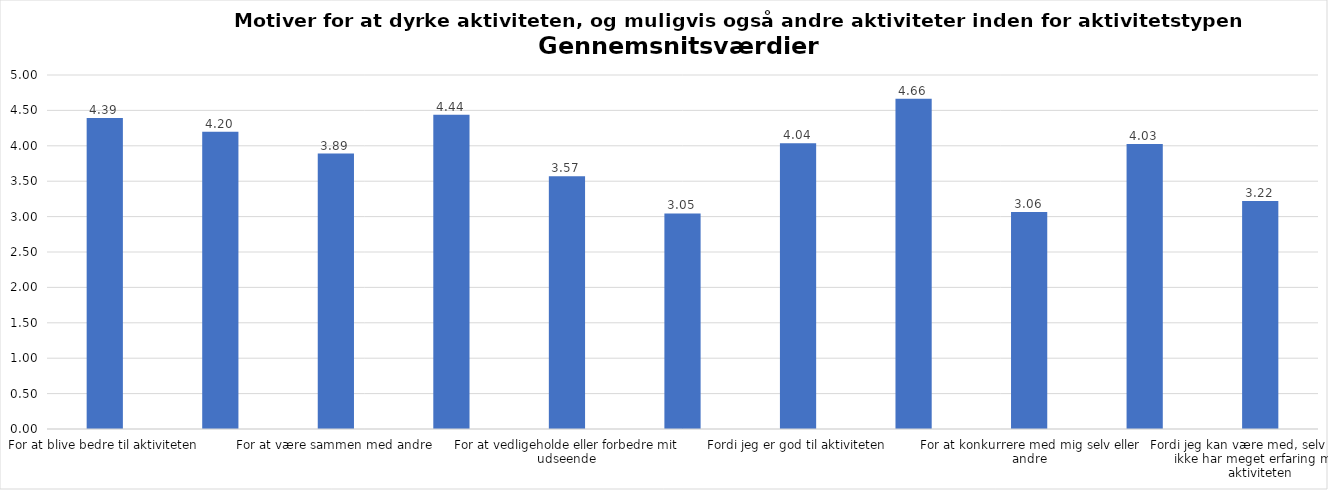
| Category | Gennemsnit |
|---|---|
| For at blive bedre til aktiviteten | 4.392 |
| For at vedligeholde eller forbedre min sundhed (fx helbred, fysisk form) | 4.2 |
| For at være sammen med andre | 3.891 |
| For at gøre noget godt for mig selv | 4.438 |
| For at vedligeholde eller forbedre mit udseende | 3.569 |
| Fordi andre i min omgangskreds opmuntrer mig til det | 3.045 |
| Fordi jeg er god til aktiviteten | 4.036 |
| Fordi jeg godt kan lide aktiviteten | 4.663 |
| For at konkurrere med mig selv eller andre | 3.064 |
| Fordi aktiviteten passer godt ind i min hverdag | 4.027 |
| Fordi jeg kan være med, selv om jeg ikke har meget erfaring med aktiviteten | 3.222 |